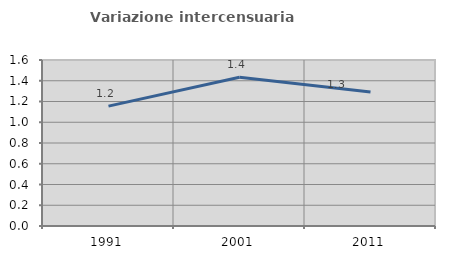
| Category | Variazione intercensuaria annua |
|---|---|
| 1991.0 | 1.156 |
| 2001.0 | 1.434 |
| 2011.0 | 1.292 |